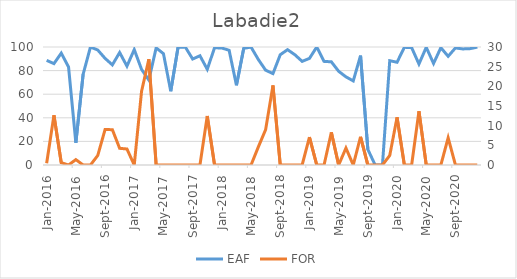
| Category | EAF |
|---|---|
| 2016-01-01 | 88.7 |
| 2016-02-01 | 85.9 |
| 2016-03-01 | 94.81 |
| 2016-04-01 | 83.02 |
| 2016-05-01 | 18.86 |
| 2016-06-01 | 76.98 |
| 2016-07-01 | 99.96 |
| 2016-08-01 | 97.44 |
| 2016-09-01 | 90.4 |
| 2016-10-01 | 84.84 |
| 2016-11-01 | 95.32 |
| 2016-12-01 | 83.78 |
| 2017-01-01 | 97.8 |
| 2017-02-01 | 81.04 |
| 2017-03-01 | 72.02 |
| 2017-04-01 | 99.26 |
| 2017-05-01 | 94.35 |
| 2017-06-01 | 62.51 |
| 2017-07-01 | 99.79 |
| 2017-08-01 | 99.91 |
| 2017-09-01 | 89.81 |
| 2017-10-01 | 92.58 |
| 2017-11-01 | 81.11 |
| 2017-12-01 | 99.32 |
| 2018-01-01 | 99.18 |
| 2018-02-01 | 97.15 |
| 2018-03-01 | 67.52 |
| 2018-04-01 | 98.89 |
| 2018-05-01 | 99.9 |
| 2018-06-01 | 89.38 |
| 2018-07-01 | 80.33 |
| 2018-08-01 | 77.45 |
| 2018-09-01 | 93.45 |
| 2018-10-01 | 97.74 |
| 2018-11-01 | 93.44 |
| 2018-12-01 | 87.83 |
| 2019-01-01 | 90.34 |
| 2019-02-01 | 100 |
| 2019-03-01 | 87.82 |
| 2019-04-01 | 87.44 |
| 2019-05-01 | 79.42 |
| 2019-06-01 | 74.71 |
| 2019-07-01 | 71.27 |
| 2019-08-01 | 92.71 |
| 2019-09-01 | 13.19 |
| 2019-10-01 | 0 |
| 2019-11-01 | 0 |
| 2019-12-01 | 88.38 |
| 2020-01-01 | 87.07 |
| 2020-02-01 | 99.75 |
| 2020-03-01 | 99.43 |
| 2020-04-01 | 85.58 |
| 2020-05-01 | 99.71 |
| 2020-06-01 | 86.06 |
| 2020-07-01 | 99.42 |
| 2020-08-01 | 92.11 |
| 2020-09-01 | 99.21 |
| 2020-10-01 | 98.36 |
| 2020-11-01 | 98.6 |
| 2020-12-01 | 99.88 |